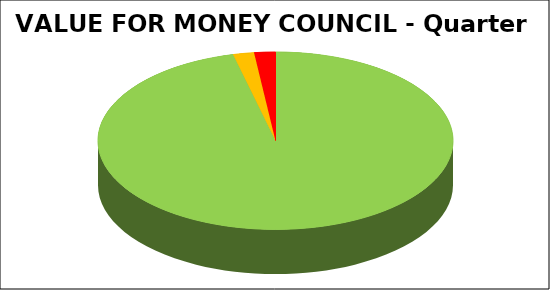
| Category | Series 0 |
|---|---|
| Green | 0.962 |
| Amber | 0.019 |
| Red | 0.019 |